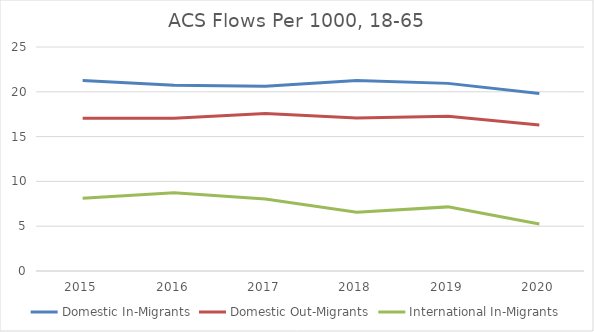
| Category | Domestic In-Migrants | Domestic Out-Migrants | International In-Migrants |
|---|---|---|---|
| 2015 | 21.252 | 17.044 | 8.106 |
| 2016 | 20.729 | 17.059 | 8.721 |
| 2017 | 20.617 | 17.58 | 8.036 |
| 2018 | 21.268 | 17.081 | 6.558 |
| 2019 | 20.941 | 17.268 | 7.156 |
| 2020 | 19.805 | 16.285 | 5.247 |